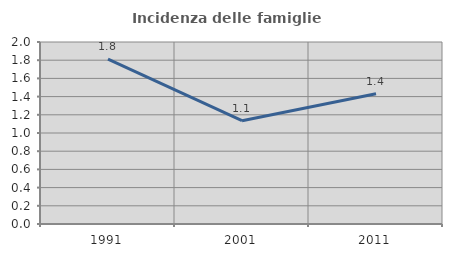
| Category | Incidenza delle famiglie numerose |
|---|---|
| 1991.0 | 1.811 |
| 2001.0 | 1.135 |
| 2011.0 | 1.432 |